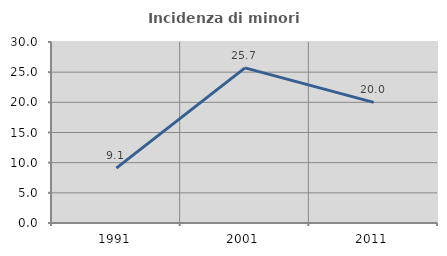
| Category | Incidenza di minori stranieri |
|---|---|
| 1991.0 | 9.091 |
| 2001.0 | 25.714 |
| 2011.0 | 20 |